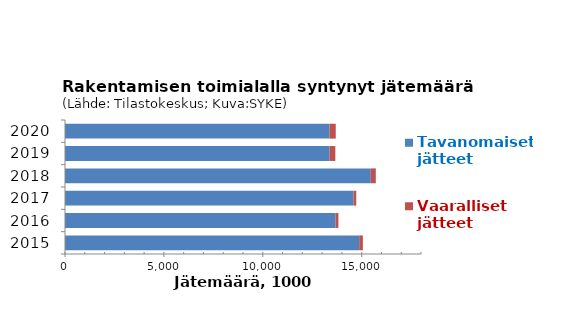
| Category | Tavanomaiset jätteet | Vaaralliset jätteet |
|---|---|---|
| 2015 | 14874.502 | 185.849 |
| 2016 | 13679.019 | 146.149 |
| 2017 | 14588.128 | 138.505 |
| 2018 | 15462.516 | 252.715 |
| 2019 | 13380.442 | 286.967 |
| 2020 | 13375 | 314 |